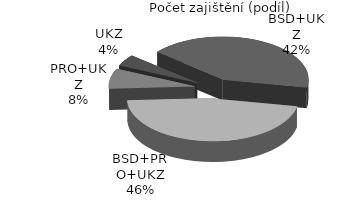
| Category | Series 0 |
|---|---|
| BSD+UKZ | 77 |
| BSD+PRO+UKZ | 85 |
| PRO+UKZ | 14 |
| UKZ | 8 |